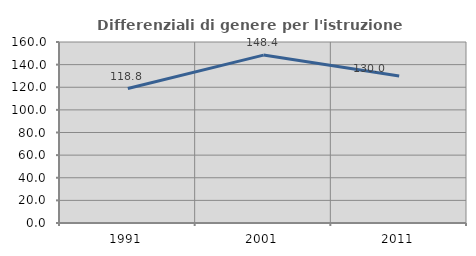
| Category | Differenziali di genere per l'istruzione superiore |
|---|---|
| 1991.0 | 118.842 |
| 2001.0 | 148.427 |
| 2011.0 | 129.967 |